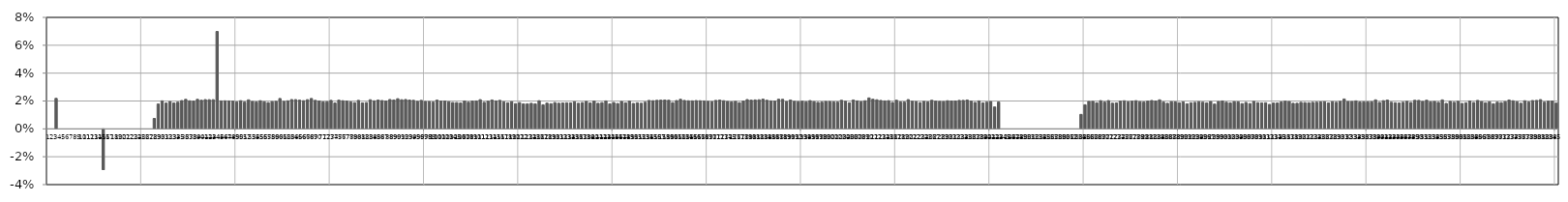
| Category | Отч. потери % |
|---|---|
| 0 | 0 |
| 1 | 0 |
| 2 | 0.022 |
| 3 | 0 |
| 4 | 0 |
| 5 | 0 |
| 6 | 0 |
| 7 | 0 |
| 8 | 0 |
| 9 | 0 |
| 10 | 0 |
| 11 | 0 |
| 12 | 0 |
| 13 | 0 |
| 14 | -0.03 |
| 15 | 0 |
| 16 | 0 |
| 17 | 0 |
| 18 | 0 |
| 19 | 0 |
| 20 | 0 |
| 21 | 0 |
| 22 | 0 |
| 23 | 0 |
| 24 | 0 |
| 25 | 0 |
| 26 | 0 |
| 27 | 0.008 |
| 28 | 0.018 |
| 29 | 0.02 |
| 30 | 0.019 |
| 31 | 0.02 |
| 32 | 0.019 |
| 33 | 0.019 |
| 34 | 0.02 |
| 35 | 0.021 |
| 36 | 0.02 |
| 37 | 0.02 |
| 38 | 0.021 |
| 39 | 0.021 |
| 40 | 0.021 |
| 41 | 0.021 |
| 42 | 0.021 |
| 43 | 0.07 |
| 44 | 0.02 |
| 45 | 0.02 |
| 46 | 0.02 |
| 47 | 0.02 |
| 48 | 0.019 |
| 49 | 0.02 |
| 50 | 0.019 |
| 51 | 0.021 |
| 52 | 0.02 |
| 53 | 0.019 |
| 54 | 0.02 |
| 55 | 0.019 |
| 56 | 0.019 |
| 57 | 0.02 |
| 58 | 0.02 |
| 59 | 0.022 |
| 60 | 0.02 |
| 61 | 0.02 |
| 62 | 0.021 |
| 63 | 0.021 |
| 64 | 0.021 |
| 65 | 0.02 |
| 66 | 0.021 |
| 67 | 0.022 |
| 68 | 0.02 |
| 69 | 0.02 |
| 70 | 0.019 |
| 71 | 0.019 |
| 72 | 0.02 |
| 73 | 0.019 |
| 74 | 0.021 |
| 75 | 0.02 |
| 76 | 0.02 |
| 77 | 0.019 |
| 78 | 0.019 |
| 79 | 0.02 |
| 80 | 0.019 |
| 81 | 0.019 |
| 82 | 0.021 |
| 83 | 0.02 |
| 84 | 0.021 |
| 85 | 0.02 |
| 86 | 0.02 |
| 87 | 0.021 |
| 88 | 0.021 |
| 89 | 0.022 |
| 90 | 0.021 |
| 91 | 0.021 |
| 92 | 0.021 |
| 93 | 0.021 |
| 94 | 0.02 |
| 95 | 0.02 |
| 96 | 0.02 |
| 97 | 0.02 |
| 98 | 0.019 |
| 99 | 0.021 |
| 100 | 0.02 |
| 101 | 0.02 |
| 102 | 0.019 |
| 103 | 0.019 |
| 104 | 0.019 |
| 105 | 0.019 |
| 106 | 0.02 |
| 107 | 0.019 |
| 108 | 0.02 |
| 109 | 0.02 |
| 110 | 0.021 |
| 111 | 0.019 |
| 112 | 0.02 |
| 113 | 0.021 |
| 114 | 0.02 |
| 115 | 0.02 |
| 116 | 0.019 |
| 117 | 0.019 |
| 118 | 0.02 |
| 119 | 0.018 |
| 120 | 0.019 |
| 121 | 0.018 |
| 122 | 0.018 |
| 123 | 0.018 |
| 124 | 0.018 |
| 125 | 0.02 |
| 126 | 0.017 |
| 127 | 0.018 |
| 128 | 0.018 |
| 129 | 0.019 |
| 130 | 0.018 |
| 131 | 0.019 |
| 132 | 0.019 |
| 133 | 0.019 |
| 134 | 0.019 |
| 135 | 0.018 |
| 136 | 0.019 |
| 137 | 0.02 |
| 138 | 0.019 |
| 139 | 0.02 |
| 140 | 0.018 |
| 141 | 0.019 |
| 142 | 0.02 |
| 143 | 0.018 |
| 144 | 0.019 |
| 145 | 0.018 |
| 146 | 0.02 |
| 147 | 0.019 |
| 148 | 0.02 |
| 149 | 0.018 |
| 150 | 0.019 |
| 151 | 0.018 |
| 152 | 0.019 |
| 153 | 0.02 |
| 154 | 0.02 |
| 155 | 0.021 |
| 156 | 0.021 |
| 157 | 0.021 |
| 158 | 0.021 |
| 159 | 0.019 |
| 160 | 0.02 |
| 161 | 0.021 |
| 162 | 0.02 |
| 163 | 0.02 |
| 164 | 0.02 |
| 165 | 0.02 |
| 166 | 0.02 |
| 167 | 0.02 |
| 168 | 0.02 |
| 169 | 0.02 |
| 170 | 0.02 |
| 171 | 0.021 |
| 172 | 0.02 |
| 173 | 0.02 |
| 174 | 0.019 |
| 175 | 0.02 |
| 176 | 0.019 |
| 177 | 0.02 |
| 178 | 0.021 |
| 179 | 0.021 |
| 180 | 0.021 |
| 181 | 0.021 |
| 182 | 0.021 |
| 183 | 0.021 |
| 184 | 0.02 |
| 185 | 0.02 |
| 186 | 0.021 |
| 187 | 0.021 |
| 188 | 0.02 |
| 189 | 0.021 |
| 190 | 0.02 |
| 191 | 0.019 |
| 192 | 0.02 |
| 193 | 0.019 |
| 194 | 0.02 |
| 195 | 0.02 |
| 196 | 0.019 |
| 197 | 0.019 |
| 198 | 0.02 |
| 199 | 0.02 |
| 200 | 0.019 |
| 201 | 0.019 |
| 202 | 0.021 |
| 203 | 0.02 |
| 204 | 0.019 |
| 205 | 0.021 |
| 206 | 0.02 |
| 207 | 0.02 |
| 208 | 0.02 |
| 209 | 0.022 |
| 210 | 0.021 |
| 211 | 0.021 |
| 212 | 0.02 |
| 213 | 0.02 |
| 214 | 0.02 |
| 215 | 0.019 |
| 216 | 0.021 |
| 217 | 0.019 |
| 218 | 0.019 |
| 219 | 0.021 |
| 220 | 0.02 |
| 221 | 0.02 |
| 222 | 0.019 |
| 223 | 0.02 |
| 224 | 0.019 |
| 225 | 0.021 |
| 226 | 0.02 |
| 227 | 0.02 |
| 228 | 0.02 |
| 229 | 0.02 |
| 230 | 0.02 |
| 231 | 0.02 |
| 232 | 0.02 |
| 233 | 0.02 |
| 234 | 0.021 |
| 235 | 0.02 |
| 236 | 0.019 |
| 237 | 0.02 |
| 238 | 0.019 |
| 239 | 0.019 |
| 240 | 0.02 |
| 241 | 0.016 |
| 242 | 0.019 |
| 243 | 0 |
| 244 | 0 |
| 245 | 0 |
| 246 | 0 |
| 247 | 0 |
| 248 | 0 |
| 249 | 0 |
| 250 | 0 |
| 251 | 0 |
| 252 | 0 |
| 253 | 0 |
| 254 | 0 |
| 255 | 0 |
| 256 | 0 |
| 257 | 0 |
| 258 | 0 |
| 259 | 0 |
| 260 | 0 |
| 261 | 0 |
| 262 | 0 |
| 263 | 0.01 |
| 264 | 0.017 |
| 265 | 0.02 |
| 266 | 0.02 |
| 267 | 0.019 |
| 268 | 0.02 |
| 269 | 0.019 |
| 270 | 0.02 |
| 271 | 0.018 |
| 272 | 0.019 |
| 273 | 0.02 |
| 274 | 0.02 |
| 275 | 0.019 |
| 276 | 0.02 |
| 277 | 0.02 |
| 278 | 0.019 |
| 279 | 0.019 |
| 280 | 0.02 |
| 281 | 0.02 |
| 282 | 0.02 |
| 283 | 0.021 |
| 284 | 0.019 |
| 285 | 0.018 |
| 286 | 0.02 |
| 287 | 0.019 |
| 288 | 0.019 |
| 289 | 0.019 |
| 290 | 0.018 |
| 291 | 0.019 |
| 292 | 0.019 |
| 293 | 0.019 |
| 294 | 0.019 |
| 295 | 0.019 |
| 296 | 0.02 |
| 297 | 0.018 |
| 298 | 0.02 |
| 299 | 0.02 |
| 300 | 0.019 |
| 301 | 0.019 |
| 302 | 0.02 |
| 303 | 0.019 |
| 304 | 0.018 |
| 305 | 0.019 |
| 306 | 0.018 |
| 307 | 0.02 |
| 308 | 0.019 |
| 309 | 0.019 |
| 310 | 0.019 |
| 311 | 0.018 |
| 312 | 0.019 |
| 313 | 0.019 |
| 314 | 0.019 |
| 315 | 0.02 |
| 316 | 0.02 |
| 317 | 0.018 |
| 318 | 0.018 |
| 319 | 0.019 |
| 320 | 0.019 |
| 321 | 0.019 |
| 322 | 0.019 |
| 323 | 0.019 |
| 324 | 0.019 |
| 325 | 0.019 |
| 326 | 0.019 |
| 327 | 0.02 |
| 328 | 0.019 |
| 329 | 0.02 |
| 330 | 0.021 |
| 331 | 0.02 |
| 332 | 0.02 |
| 333 | 0.02 |
| 334 | 0.019 |
| 335 | 0.019 |
| 336 | 0.019 |
| 337 | 0.019 |
| 338 | 0.021 |
| 339 | 0.019 |
| 340 | 0.02 |
| 341 | 0.021 |
| 342 | 0.019 |
| 343 | 0.019 |
| 344 | 0.019 |
| 345 | 0.019 |
| 346 | 0.02 |
| 347 | 0.019 |
| 348 | 0.021 |
| 349 | 0.02 |
| 350 | 0.02 |
| 351 | 0.021 |
| 352 | 0.019 |
| 353 | 0.02 |
| 354 | 0.019 |
| 355 | 0.021 |
| 356 | 0.018 |
| 357 | 0.02 |
| 358 | 0.019 |
| 359 | 0.02 |
| 360 | 0.018 |
| 361 | 0.019 |
| 362 | 0.02 |
| 363 | 0.019 |
| 364 | 0.02 |
| 365 | 0.02 |
| 366 | 0.019 |
| 367 | 0.019 |
| 368 | 0.018 |
| 369 | 0.019 |
| 370 | 0.019 |
| 371 | 0.02 |
| 372 | 0.021 |
| 373 | 0.02 |
| 374 | 0.019 |
| 375 | 0.018 |
| 376 | 0.02 |
| 377 | 0.019 |
| 378 | 0.02 |
| 379 | 0.02 |
| 380 | 0.021 |
| 381 | 0.019 |
| 382 | 0.02 |
| 383 | 0.02 |
| 384 | 0.018 |